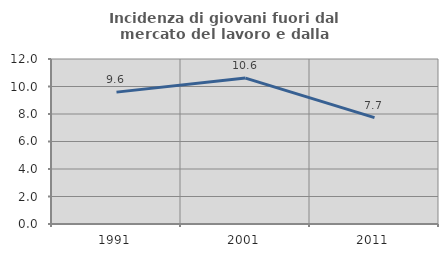
| Category | Incidenza di giovani fuori dal mercato del lavoro e dalla formazione  |
|---|---|
| 1991.0 | 9.592 |
| 2001.0 | 10.611 |
| 2011.0 | 7.732 |